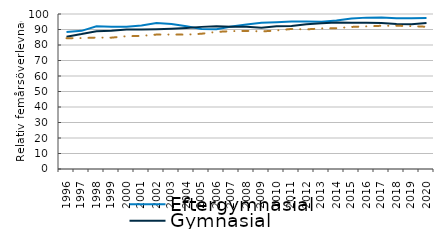
| Category | Eftergymnasial | Gymnasial | Förgymnasial |
|---|---|---|---|
| 1996 | 88.337 | 85.389 | 84.398 |
| 1997 | 89.136 | 87.033 | 84.461 |
| 1998 | 92.139 | 88.905 | 84.787 |
| 1999 | 91.831 | 89.231 | 84.747 |
| 2000 | 91.815 | 90.042 | 85.676 |
| 2001 | 92.608 | 89.924 | 85.871 |
| 2002 | 94.158 | 90.173 | 86.725 |
| 2003 | 93.557 | 90.514 | 86.743 |
| 2004 | 92.132 | 91.041 | 86.682 |
| 2005 | 90.374 | 91.694 | 87.264 |
| 2006 | 90.23 | 92.123 | 88.459 |
| 2007 | 91.942 | 91.85 | 88.945 |
| 2008 | 93.265 | 91.702 | 89.106 |
| 2009 | 94.323 | 91.199 | 88.737 |
| 2010 | 94.672 | 92.102 | 89.346 |
| 2011 | 95.142 | 92.263 | 90.365 |
| 2012 | 95.166 | 93.323 | 90.082 |
| 2013 | 95.048 | 93.966 | 90.715 |
| 2014 | 95.803 | 94.465 | 90.85 |
| 2015 | 97.104 | 94.42 | 91.653 |
| 2016 | 97.661 | 94.421 | 92.037 |
| 2017 | 97.7 | 94.205 | 92.398 |
| 2018 | 97.232 | 93.556 | 92.422 |
| 2019 | 97.243 | 93.456 | 92.177 |
| 2020 | 97.382 | 94.259 | 91.764 |